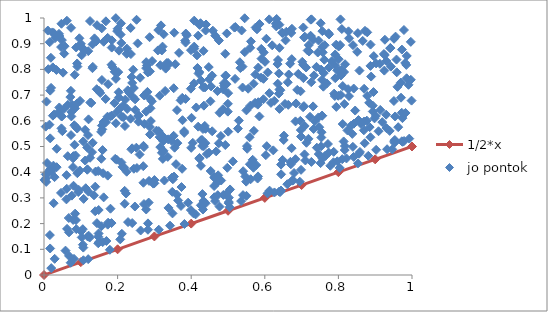
| Category | 1/2*x |
|---|---|
| 0.0 | 0 |
| 0.1 | 0.05 |
| 0.2 | 0.1 |
| 0.3 | 0.15 |
| 0.4 | 0.2 |
| 0.5 | 0.25 |
| 0.6 | 0.3 |
| 0.7 | 0.35 |
| 0.8 | 0.4 |
| 0.9 | 0.45 |
| 1.0 | 0.5 |